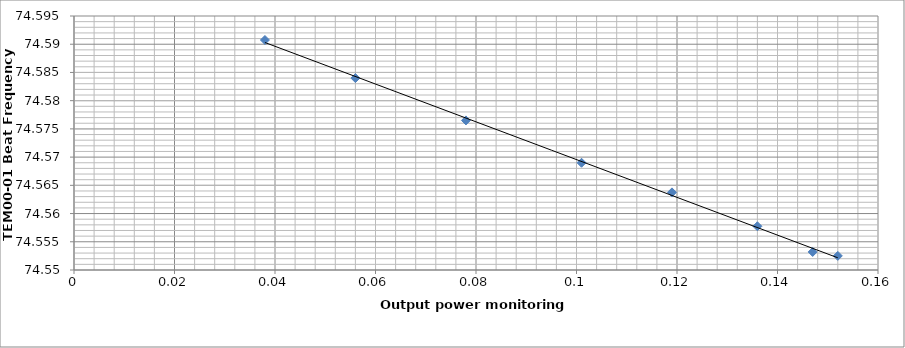
| Category | Series 0 |
|---|---|
| 0.152 | 74.552 |
| 0.147 | 74.553 |
| 0.136 | 74.558 |
| 0.119 | 74.564 |
| 0.101 | 74.569 |
| 0.078 | 74.576 |
| 0.056 | 74.584 |
| 0.038 | 74.591 |